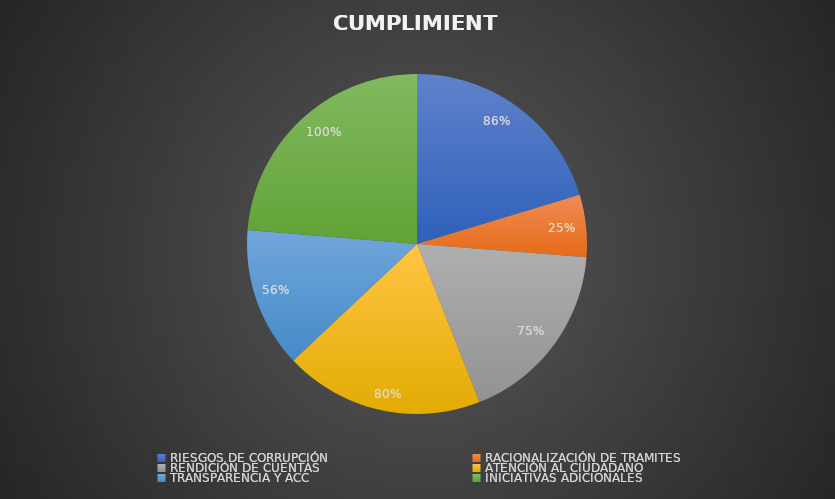
| Category | Series 0 |
|---|---|
| RIESGOS DE CORRUPCIÓN | 0.857 |
| RACIONALIZACIÓN DE TRAMITES | 0.25 |
| RENDICIÓN DE CUENTAS | 0.75 |
| ATENCIÓN AL CIUDADANO | 0.8 |
| TRANSPARENCIA Y ACC | 0.562 |
| INICIATIVAS ADICIONALES | 1 |